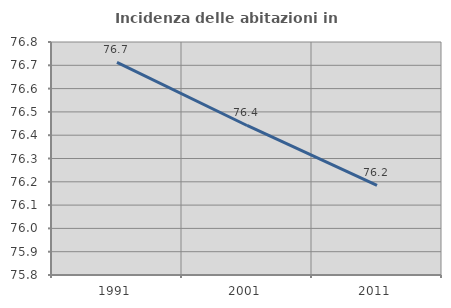
| Category | Incidenza delle abitazioni in proprietà  |
|---|---|
| 1991.0 | 76.712 |
| 2001.0 | 76.442 |
| 2011.0 | 76.184 |